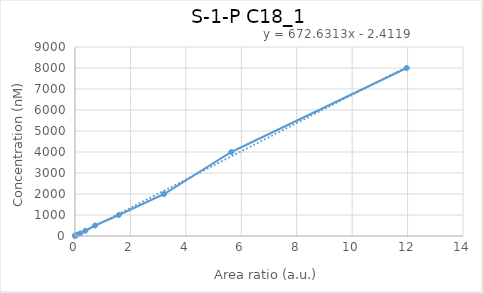
| Category | S-1-P C18_1 |
|---|---|
| 0.0 | 0 |
| 0.00165799 | 31.25 |
| 0.0795102 | 62.5 |
| 0.193704 | 125 |
| 0.37308 | 250 |
| 0.723845 | 500 |
| 1.5826 | 1000 |
| 3.21179 | 2000 |
| 5.64119 | 4000 |
| 11.9692 | 8000 |